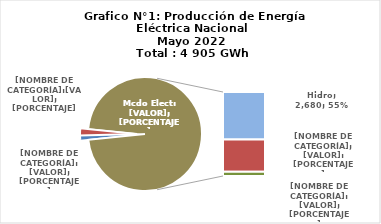
| Category | Series 0 |
|---|---|
| 0 | 58.667 |
| 1 | 99.892 |
| 2 | 2679.584 |
| 3 | 1833.186 |
| 4 | 234.085 |